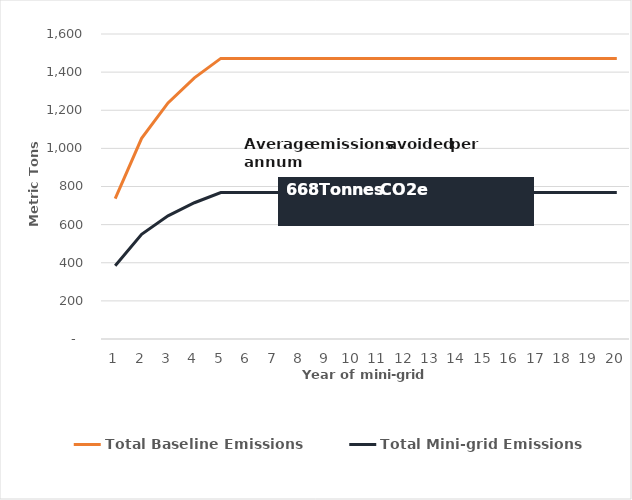
| Category | Total Baseline Emissions | Total Mini-grid Emissions |
|---|---|---|
| 0 | 735.966 | 384 |
| 1 | 1052.929 | 549.38 |
| 2 | 1238.341 | 646.121 |
| 3 | 1369.893 | 714.76 |
| 4 | 1471.932 | 768 |
| 5 | 1471.932 | 768 |
| 6 | 1471.932 | 768 |
| 7 | 1471.932 | 768 |
| 8 | 1471.932 | 768 |
| 9 | 1471.932 | 768 |
| 10 | 1471.932 | 768 |
| 11 | 1471.932 | 768 |
| 12 | 1471.932 | 768 |
| 13 | 1471.932 | 768 |
| 14 | 1471.932 | 768 |
| 15 | 1471.932 | 768 |
| 16 | 1471.932 | 768 |
| 17 | 1471.932 | 768 |
| 18 | 1471.932 | 768 |
| 19 | 1471.932 | 768 |